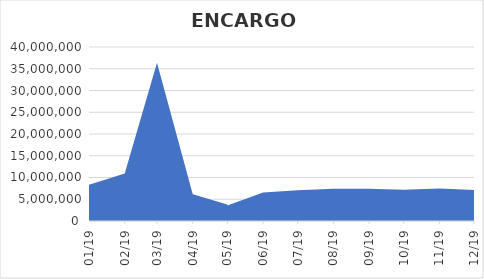
| Category | Series 0 |
|---|---|
| 2019-01-01 | 8351145.15 |
| 2019-02-01 | 10930050.93 |
| 2019-03-01 | 36366027.16 |
| 2019-04-01 | 6160736.93 |
| 2019-05-01 | 3791315.861 |
| 2019-05-01 | 3554358.619 |
| 2019-06-01 | 6578709.9 |
| 2019-07-01 | 7096612.81 |
| 2019-08-01 | 7395818.25 |
| 2019-09-01 | 7435975.82 |
| 2019-10-01 | 7200711.43 |
| 2019-11-01 | 7498751.74 |
| 2019-12-01 | 7137413.39 |